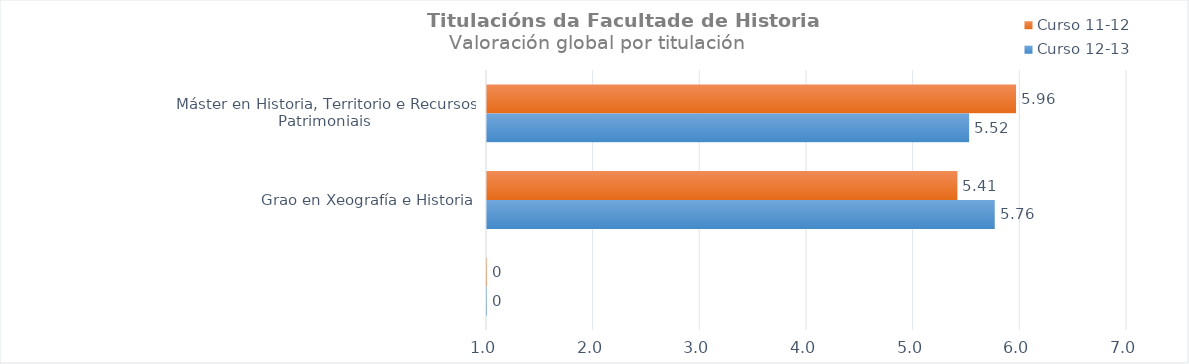
| Category | Curso 12-13 | Curso 11-12 |
|---|---|---|
|  | 0 | 0 |
| Grao en Xeografía e Historia | 5.76 | 5.41 |
| Máster en Historia, Territorio e Recursos Patrimoniais | 5.52 | 5.96 |